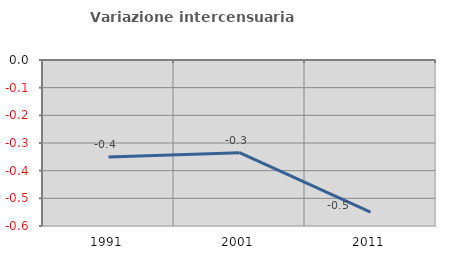
| Category | Variazione intercensuaria annua |
|---|---|
| 1991.0 | -0.351 |
| 2001.0 | -0.335 |
| 2011.0 | -0.549 |